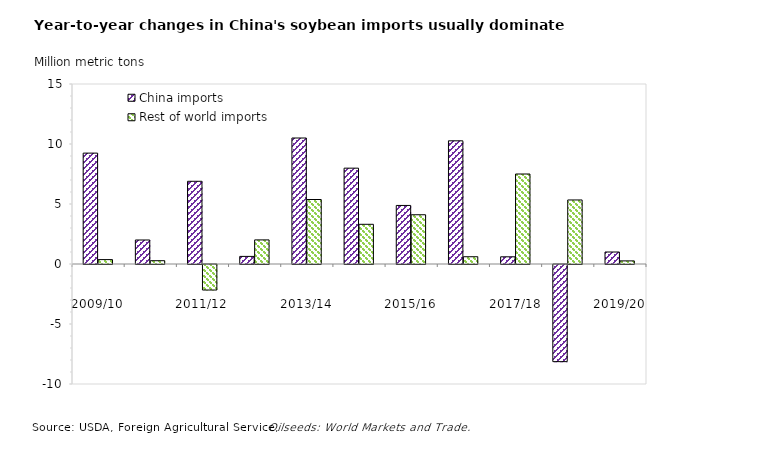
| Category | China | Rest of world |
|---|---|---|
| 2009/10 | 9.24 | 0.366 |
| 2010/11 | 2.001 | 0.276 |
| 2011/12 | 6.892 | -2.127 |
| 2012/13 | 0.634 | 2.009 |
| 2013/14 | 10.499 | 5.374 |
| 2014/15 | 7.986 | 3.308 |
| 2015/16 | 4.88 | 4.104 |
| 2016/17 | 10.265 | 0.605 |
| 2017/18 | 0.6 | 7.499 |
| 2018/19 | -8.095 | 5.337 |
| 2019/20 | 1 | 0.26 |